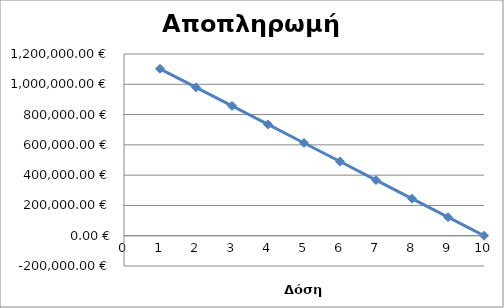
| Category | Series 0 |
|---|---|
| 1.0 | 1102312.26 |
| 2.0 | 979833.12 |
| 3.0 | 857353.98 |
| 4.0 | 734874.84 |
| 5.0 | 612395.7 |
| 6.0 | 489916.56 |
| 7.0 | 367437.42 |
| 8.0 | 244958.28 |
| 9.0 | 122479.14 |
| 10.0 | 0 |